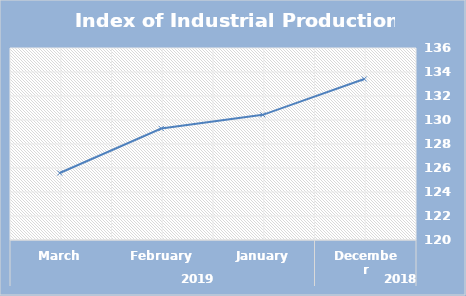
| Category | Index |
|---|---|
| 0 | 133.42 |
| 1 | 130.43 |
| 2 | 129.29 |
| 3 | 125.58 |